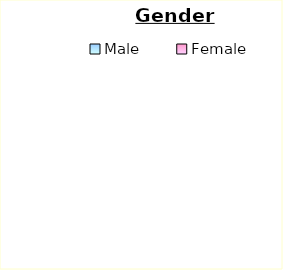
| Category | Series 0 |
|---|---|
| Male | 0 |
| Female | 0 |